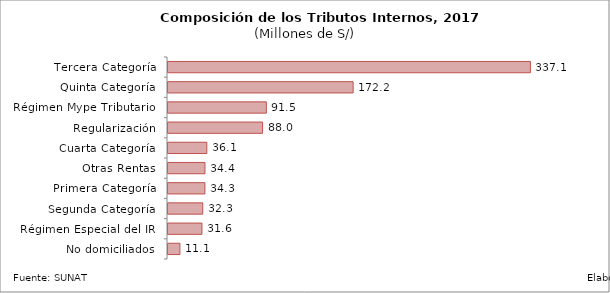
| Category | Series 0 | Series 1 | Series 2 |
|---|---|---|---|
|    Tercera Categoría |  |  | 337.116 |
|    Quinta Categoría |  |  | 172.214 |
|    Régimen Mype Tributario |  |  | 91.492 |
|    Regularización |  |  | 87.987 |
|    Cuarta Categoría |  |  | 36.093 |
|    Otras Rentas |  |  | 34.376 |
|    Primera Categoría |  |  | 34.342 |
|    Segunda Categoría |  |  | 32.336 |
|    Régimen Especial del IR |  |  | 31.588 |
|    No domiciliados |  |  | 11.079 |